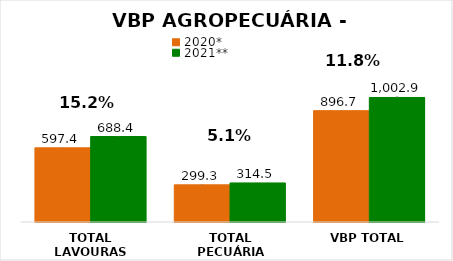
| Category | 2020* | 2021** |
|---|---|---|
| TOTAL LAVOURAS | 597.373 | 688.369 |
| TOTAL PECUÁRIA | 299.286 | 314.484 |
| VBP TOTAL | 896.659 | 1002.853 |